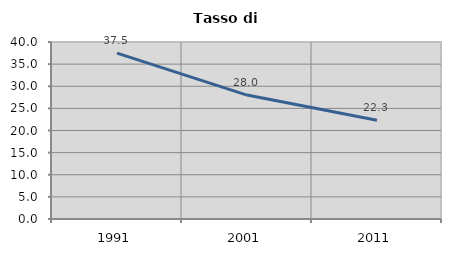
| Category | Tasso di disoccupazione   |
|---|---|
| 1991.0 | 37.478 |
| 2001.0 | 28.003 |
| 2011.0 | 22.321 |